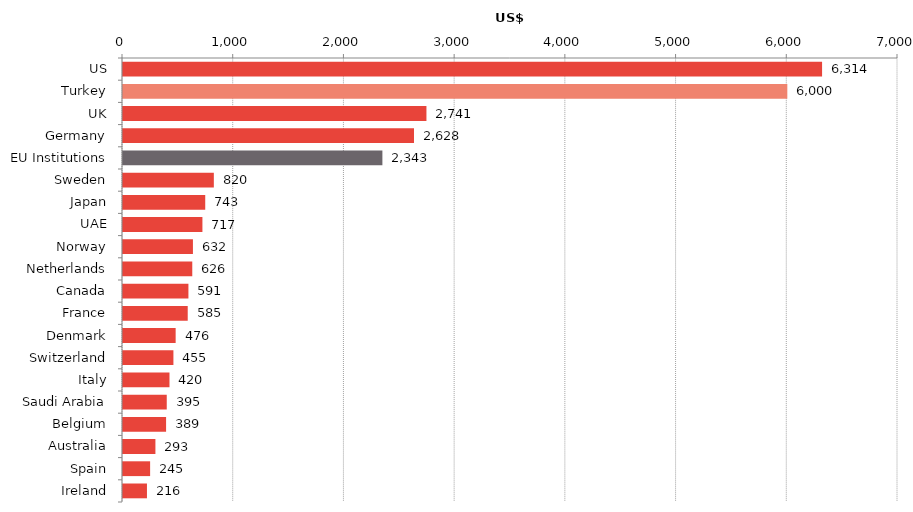
| Category | 2016 |
|---|---|
| US | 6314.256 |
| Turkey | 6000.346 |
| UK | 2740.738 |
| Germany | 2628.36 |
| EU Institutions | 2342.934 |
| Sweden | 820.479 |
| Japan | 742.756 |
| UAE | 717.337 |
| Norway | 631.685 |
| Netherlands | 625.68 |
| Canada | 590.89 |
| France | 584.603 |
| Denmark | 475.558 |
| Switzerland | 455.373 |
| Italy | 419.918 |
| Saudi Arabia | 395.184 |
| Belgium | 389.152 |
| Australia | 292.805 |
| Spain | 244.94 |
| Ireland | 216.447 |